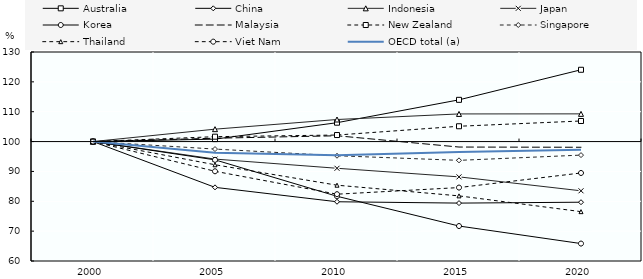
| Category | Australia | China | Indonesia | Japan | Korea | Malaysia | New Zealand | Singapore | Thailand | Viet Nam | OECD total (a) |
|---|---|---|---|---|---|---|---|---|---|---|---|
| 2000.0 | 100 | 100 | 100 | 100 | 100 | 100 | 100 | 100 | 100 | 100 | 100 |
| 2005.0 | 100.818 | 84.667 | 104.158 | 94.135 | 93.878 | 101.121 | 101.64 | 97.486 | 92.236 | 90.051 | 96.264 |
| 2010.0 | 106.321 | 79.841 | 107.39 | 91.055 | 81.679 | 101.946 | 102.187 | 95.254 | 85.387 | 82.377 | 95.456 |
| 2015.0 | 113.978 | 79.394 | 109.258 | 88.179 | 71.713 | 98.166 | 105.131 | 93.71 | 81.813 | 84.593 | 96.466 |
| 2020.0 | 124.047 | 79.688 | 109.277 | 83.512 | 65.84 | 98.093 | 106.892 | 95.468 | 76.532 | 89.481 | 97.225 |